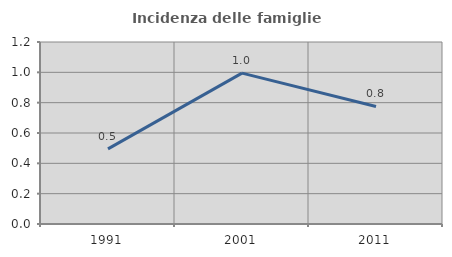
| Category | Incidenza delle famiglie numerose |
|---|---|
| 1991.0 | 0.495 |
| 2001.0 | 0.995 |
| 2011.0 | 0.775 |